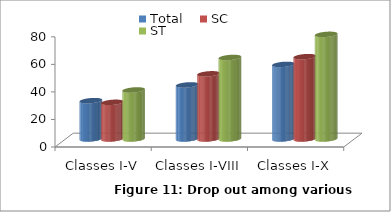
| Category | Total | SC | ST |
|---|---|---|---|
| Classes I-V | 27.844 | 26.627 | 35.611 |
| Classes I-VIII | 39.275 | 47.322 | 59.21 |
| Classes I-X | 54.175 | 59.796 | 75.983 |